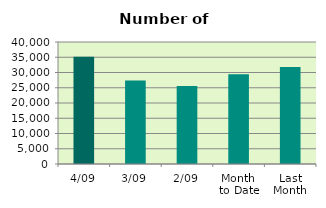
| Category | Series 0 |
|---|---|
| 4/09 | 35166 |
| 3/09 | 27418 |
| 2/09 | 25590 |
| Month 
to Date | 29391.333 |
| Last
Month | 31813.182 |